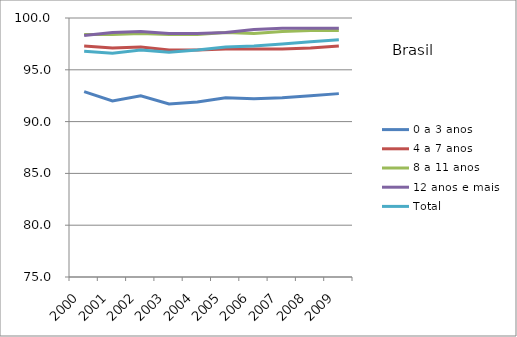
| Category | 0 a 3 anos | 4 a 7 anos | 8 a 11 anos | 12 anos e mais | Total |
|---|---|---|---|---|---|
| 2000.0 | 92.9 | 97.3 | 98.4 | 98.3 | 96.8 |
| 2001.0 | 92 | 97.1 | 98.4 | 98.6 | 96.6 |
| 2002.0 | 92.5 | 97.2 | 98.5 | 98.7 | 96.9 |
| 2003.0 | 91.7 | 96.9 | 98.4 | 98.5 | 96.7 |
| 2004.0 | 91.9 | 96.9 | 98.4 | 98.5 | 96.9 |
| 2005.0 | 92.3 | 97 | 98.6 | 98.6 | 97.2 |
| 2006.0 | 92.2 | 97 | 98.5 | 98.9 | 97.3 |
| 2007.0 | 92.3 | 97 | 98.7 | 99 | 97.5 |
| 2008.0 | 92.5 | 97.1 | 98.8 | 99 | 97.7 |
| 2009.0 | 92.7 | 97.3 | 98.8 | 99 | 97.9 |